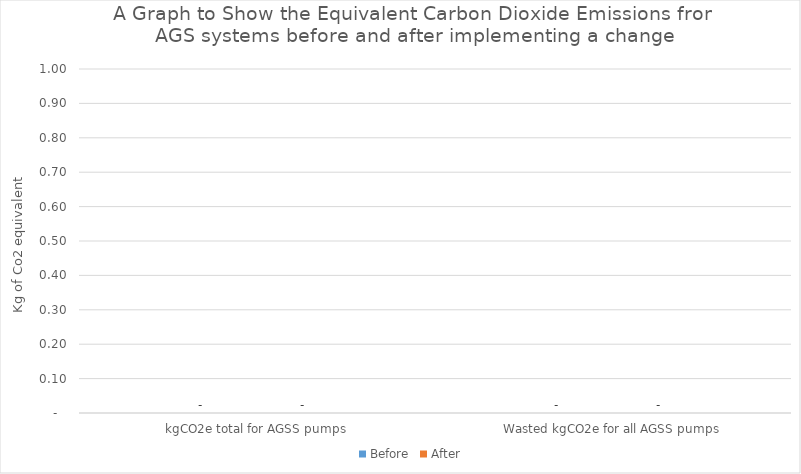
| Category | Before | After |
|---|---|---|
| kgCO2e total for AGSS pumps | 0 | 0 |
| Wasted kgCO2e for all AGSS pumps | 0 | 0 |